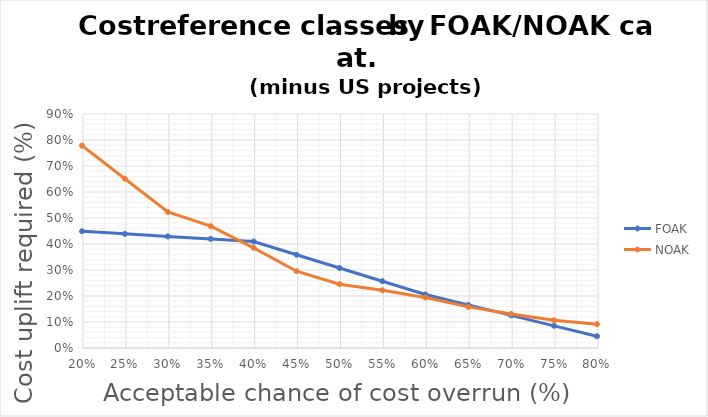
| Category | FOAK | NOAK |
|---|---|---|
| 0.8 | 0.045 | 0.091 |
| 0.75 | 0.085 | 0.107 |
| 0.7 | 0.125 | 0.131 |
| 0.65 | 0.166 | 0.158 |
| 0.6 | 0.206 | 0.194 |
| 0.55 | 0.257 | 0.222 |
| 0.5 | 0.308 | 0.246 |
| 0.45 | 0.359 | 0.295 |
| 0.399999999999999 | 0.409 | 0.385 |
| 0.349999999999999 | 0.419 | 0.469 |
| 0.299999999999999 | 0.429 | 0.523 |
| 0.249999999999999 | 0.439 | 0.651 |
| 0.199999999999999 | 0.449 | 0.778 |